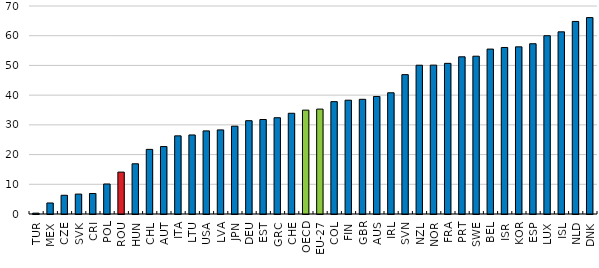
| Category | Series1 |
|---|---|
| TUR | 0.286 |
| MEX | 3.711 |
| CZE | 6.3 |
| SVK | 6.7 |
| CRI | 6.902 |
| POL | 10.1 |
| ROU | 14.1 |
| HUN | 16.9 |
| CHL | 21.745 |
| AUT | 22.7 |
| ITA | 26.3 |
| LTU | 26.6 |
| USA | 27.969 |
| LVA | 28.3 |
| JPN | 29.553 |
| DEU | 31.4 |
| EST | 31.8 |
| GRC | 32.4 |
| CHE | 33.9 |
| OECD | 34.953 |
| EU-27 | 35.3 |
| COL | 37.812 |
| FIN | 38.3 |
| GBR | 38.6 |
| AUS | 39.555 |
| IRL | 40.8 |
| SVN | 46.9 |
| NZL | 50.066 |
| NOR | 50.1 |
| FRA | 50.7 |
| PRT | 52.9 |
| SWE | 53.1 |
| BEL | 55.5 |
| ISR | 56.039 |
| KOR | 56.253 |
| ESP | 57.3 |
| LUX | 60 |
| ISL | 61.3 |
| NLD | 64.8 |
| DNK | 66.1 |